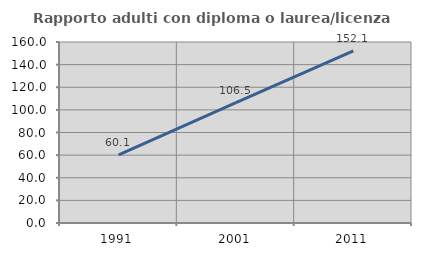
| Category | Rapporto adulti con diploma o laurea/licenza media  |
|---|---|
| 1991.0 | 60.117 |
| 2001.0 | 106.48 |
| 2011.0 | 152.05 |